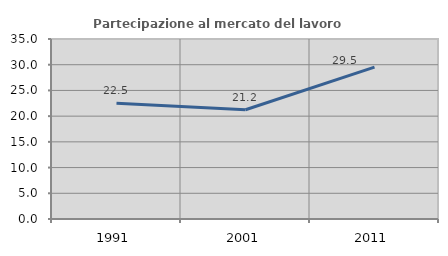
| Category | Partecipazione al mercato del lavoro  femminile |
|---|---|
| 1991.0 | 22.497 |
| 2001.0 | 21.248 |
| 2011.0 | 29.535 |